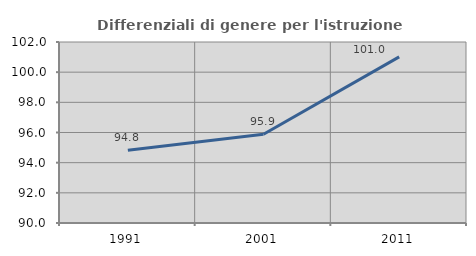
| Category | Differenziali di genere per l'istruzione superiore |
|---|---|
| 1991.0 | 94.827 |
| 2001.0 | 95.888 |
| 2011.0 | 101.016 |